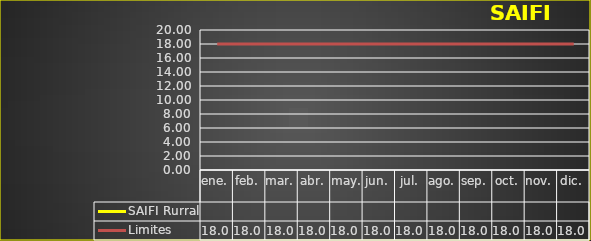
| Category | SAIFI Rurral | Limites |
|---|---|---|
| ene. |  | 18 |
| feb. |  | 18 |
| mar. |  | 18 |
| abr. |  | 18 |
| may. |  | 18 |
| jun. |  | 18 |
| jul. |  | 18 |
| ago. |  | 18 |
| sep. |  | 18 |
| oct. |  | 18 |
| nov. |  | 18 |
| dic. |  | 18 |